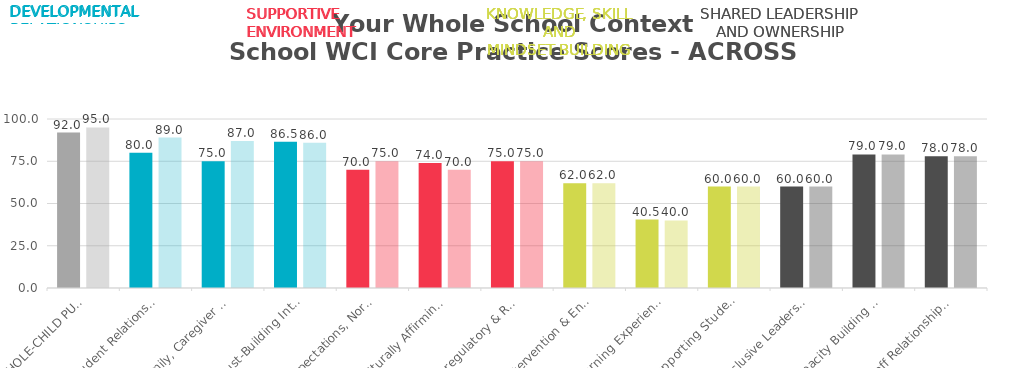
| Category | Time 1 | Time 2 |
|---|---|---|
| WHOLE-CHILD PURPOSE | 92 | 95 |
| Student Relationship Structures | 80 | 89 |
| Family, Caregiver & Community Partnerships | 75 | 87 |
| Trust-Building Interactions  | 86.5 | 86 |
| Expectations, Norms & Routines | 70 | 75 |
| Culturally Affirming & Sustaining Practices  | 74 | 70 |
| Co-regulatory & Restorative Practices | 75 | 75 |
| Intervention & Enrichment Structures  | 62 | 62 |
| Learning Experiences in Zone of Proximal Development  | 40.5 | 40 |
| Supporting Student Agency | 60 | 60 |
| Inclusive Leadership  | 60 | 60 |
| Capacity Building for Whole Child Development  | 79 | 79 |
| Staff Relationships and Collaboration | 78 | 78 |